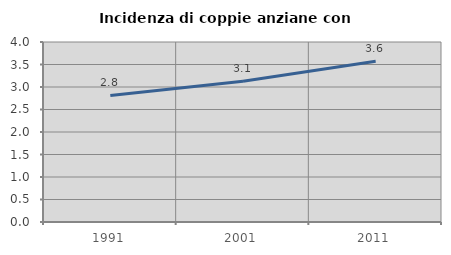
| Category | Incidenza di coppie anziane con figli |
|---|---|
| 1991.0 | 2.812 |
| 2001.0 | 3.127 |
| 2011.0 | 3.574 |